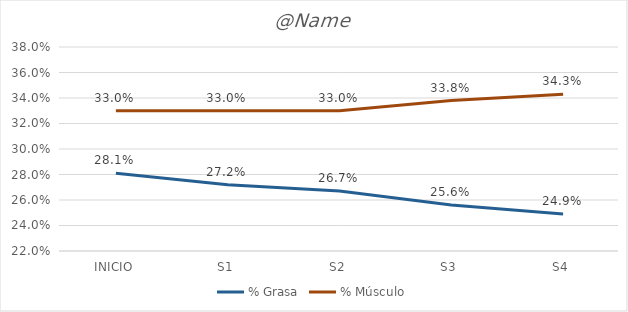
| Category | % Grasa | % Músculo |
|---|---|---|
| INICIO | 0.281 | 0.33 |
| S1 | 0.272 | 0.33 |
| S2 | 0.267 | 0.33 |
| S3 | 0.256 | 0.338 |
| S4 | 0.249 | 0.343 |